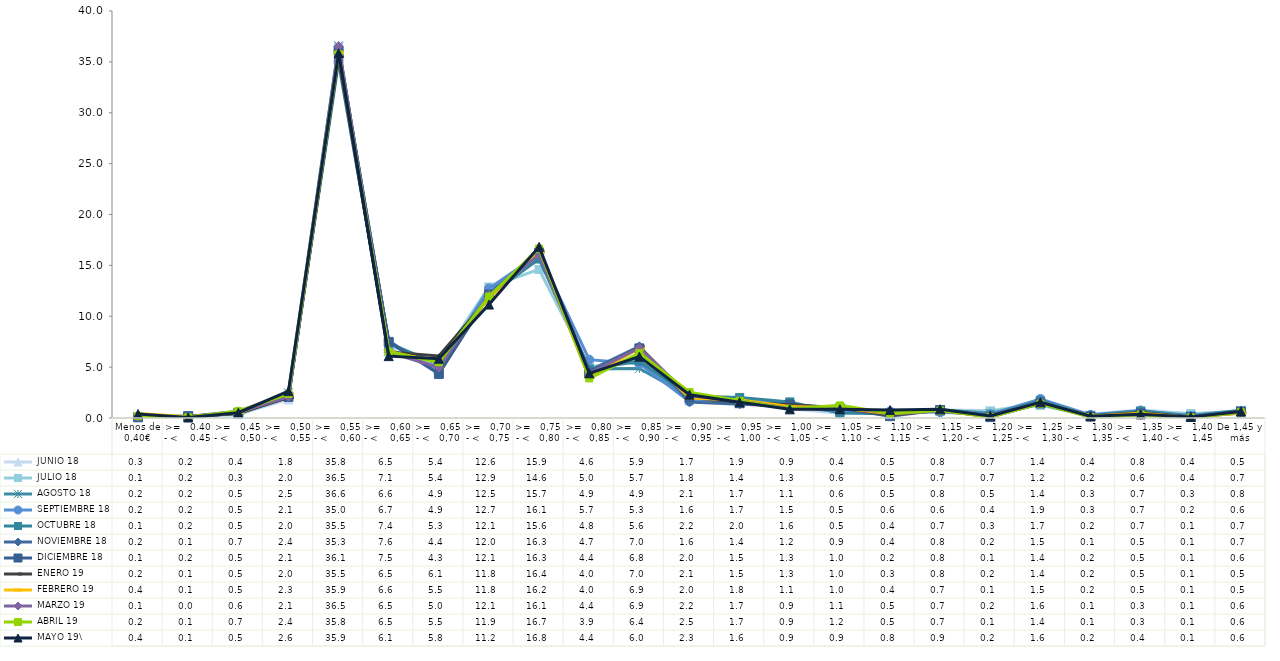
| Category |  JUNIO 18 |  JULIO 18 |  AGOSTO 18 |  SEPTIEMBRE 18 |  OCTUBRE 18 |  NOVIEMBRE 18 |  DICIEMBRE 18 |  ENERO 19 |  FEBRERO 19 |  MARZO 19 |  ABRIL 19 |  MAYO 19\ |
|---|---|---|---|---|---|---|---|---|---|---|---|---|
| Menos de 0,40€ | 0.28 | 0.12 | 0.15 | 0.17 | 0.08 | 0.16 | 0.07 | 0.2 | 0.44 | 0.13 | 0.18 | 0.39 |
| >=   0.40 - <    0.45 | 0.17 | 0.22 | 0.15 | 0.15 | 0.15 | 0.14 | 0.18 | 0.08 | 0.12 | 0.03 | 0.06 | 0.05 |
| >=   0,45 - <    0,50 | 0.4 | 0.33 | 0.47 | 0.45 | 0.53 | 0.66 | 0.47 | 0.46 | 0.52 | 0.56 | 0.68 | 0.52 |
| >=   0,50 - <    0,55 | 1.81 | 2.02 | 2.48 | 2.09 | 2.02 | 2.35 | 2.08 | 2 | 2.28 | 2.09 | 2.36 | 2.64 |
| >=   0,55 - <    0,60 | 35.81 | 36.45 | 36.59 | 34.99 | 35.48 | 35.27 | 36.11 | 35.5 | 35.91 | 36.53 | 35.75 | 35.85 |
| >=   0,60 - <    0,65 | 6.54 | 7.09 | 6.6 | 6.71 | 7.36 | 7.6 | 7.48 | 6.48 | 6.55 | 6.45 | 6.51 | 6.08 |
| >=   0,65 - <   0,70 | 5.37 | 5.43 | 4.89 | 4.94 | 5.26 | 4.37 | 4.33 | 6.09 | 5.48 | 4.96 | 5.48 | 5.82 |
| >=   0,70 - <   0,75 | 12.63 | 12.87 | 12.53 | 12.72 | 12.06 | 12.03 | 12.14 | 11.8 | 11.8 | 12.07 | 11.94 | 11.15 |
| >=   0,75 - <   0,80 | 15.89 | 14.6 | 15.68 | 16.11 | 15.63 | 16.31 | 16.26 | 16.37 | 16.24 | 16.05 | 16.66 | 16.82 |
| >=   0,80 - <   0,85 | 4.61 | 5.02 | 4.85 | 5.73 | 4.81 | 4.65 | 4.4 | 4.02 | 4.03 | 4.37 | 3.89 | 4.39 |
| >=   0,85 - <   0,90 | 5.93 | 5.66 | 4.87 | 5.34 | 5.57 | 7.04 | 6.84 | 6.98 | 6.85 | 6.9 | 6.39 | 6.03 |
| >=   0,90 - <    0,95 | 1.71 | 1.79 | 2.1 | 1.62 | 2.15 | 1.56 | 2.04 | 2.1 | 1.96 | 2.19 | 2.54 | 2.29 |
| >=   0,95 - <   1,00 | 1.92 | 1.43 | 1.74 | 1.68 | 2.01 | 1.35 | 1.45 | 1.54 | 1.76 | 1.7 | 1.69 | 1.55 |
| >=   1,00 - <   1,05 | 0.91 | 1.3 | 1.1 | 1.47 | 1.58 | 1.18 | 1.33 | 1.31 | 1.14 | 0.93 | 0.88 | 0.85 |
| >=   1,05 - <    1,10 | 0.44 | 0.63 | 0.64 | 0.52 | 0.5 | 0.9 | 0.95 | 1.02 | 1.01 | 1.08 | 1.24 | 0.86 |
| >=   1,10 - <   1,15 | 0.54 | 0.45 | 0.48 | 0.64 | 0.42 | 0.44 | 0.18 | 0.29 | 0.42 | 0.48 | 0.46 | 0.78 |
| >=   1,15 - <    1,20 | 0.78 | 0.7 | 0.82 | 0.57 | 0.71 | 0.79 | 0.78 | 0.79 | 0.71 | 0.66 | 0.73 | 0.86 |
| >=   1,20 - <    1,25 | 0.73 | 0.69 | 0.46 | 0.38 | 0.3 | 0.23 | 0.09 | 0.2 | 0.12 | 0.19 | 0.11 | 0.21 |
| >=   1,25 - <    1,30 | 1.42 | 1.24 | 1.43 | 1.87 | 1.68 | 1.5 | 1.43 | 1.43 | 1.46 | 1.55 | 1.41 | 1.55 |
| >=   1,30 - <    1,35 | 0.37 | 0.2 | 0.28 | 0.31 | 0.21 | 0.1 | 0.15 | 0.18 | 0.18 | 0.11 | 0.09 | 0.17 |
| >=   1,35 - <    1,40 | 0.81 | 0.63 | 0.68 | 0.73 | 0.68 | 0.5 | 0.45 | 0.53 | 0.46 | 0.3 | 0.33 | 0.36 |
| >=   1,40 - <    1,45 | 0.42 | 0.43 | 0.25 | 0.18 | 0.14 | 0.11 | 0.12 | 0.08 | 0.06 | 0.07 | 0.06 | 0.11 |
| De 1,45 y más | 0.51 | 0.68 | 0.76 | 0.61 | 0.67 | 0.72 | 0.63 | 0.5 | 0.49 | 0.57 | 0.56 | 0.64 |